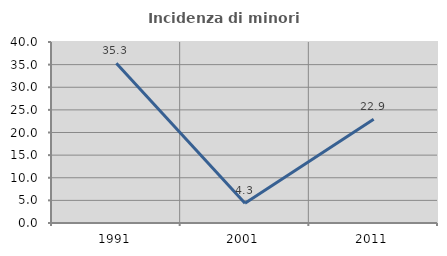
| Category | Incidenza di minori stranieri |
|---|---|
| 1991.0 | 35.294 |
| 2001.0 | 4.348 |
| 2011.0 | 22.917 |